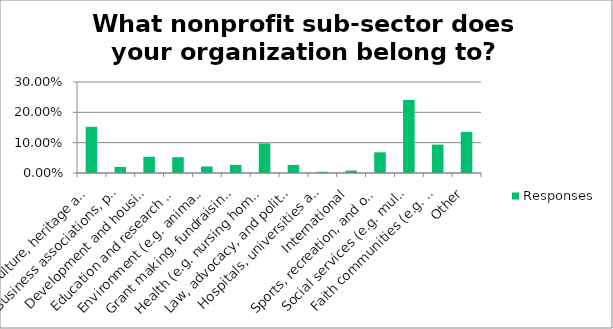
| Category | Responses |
|---|---|
| Arts, culture, heritage and tourism | 0.152 |
| Business associations, professional associations and unions | 0.02 |
| Development and housing  (e.g. social planning,community development, employment & training) | 0.054 |
| Education and research (e.g. primary & secondary education, higher education, research) | 0.052 |
| Environment (e.g. animal welfare) | 0.021 |
| Grant making, fundraising, and voluntarism promotion | 0.027 |
| Health (e.g. nursing homes, mental health and crisis intervention) | 0.098 |
| Law, advocacy, and politics (e.g. civic & advocacy organizations, law & legal services, political organizations) | 0.027 |
| Hospitals, universities and colleges | 0.004 |
| International | 0.008 |
| Sports, recreation, and other social clubs (e.g. leisure clubs, fitness and wellness, amateur sports) | 0.068 |
| Social services (e.g. multi-service agencies, child care, settlement services, services for seniors) | 0.241 |
| Faith communities (e.g. churches, mosques, synagogues) | 0.094 |
| Other | 0.135 |